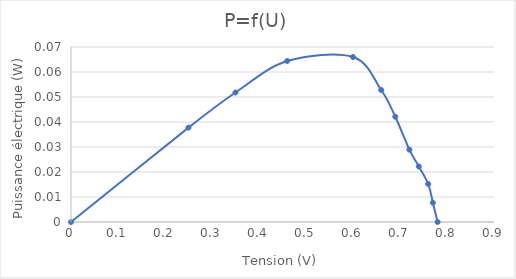
| Category | Series 0 |
|---|---|
| 0.78 | 0 |
| 0.77 | 0.008 |
| 0.76 | 0.015 |
| 0.74 | 0.022 |
| 0.72 | 0.029 |
| 0.69 | 0.042 |
| 0.66 | 0.053 |
| 0.6 | 0.066 |
| 0.46 | 0.064 |
| 0.35 | 0.052 |
| 0.25 | 0.038 |
| 0.0 | 0 |